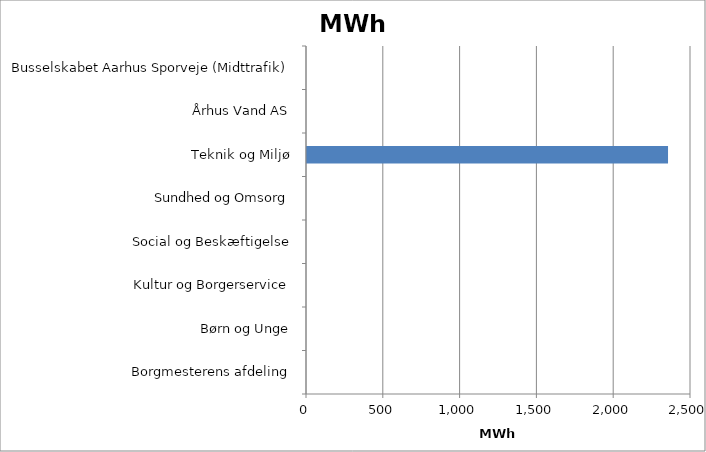
| Category | Varmeforbrug MWh |
|---|---|
| Borgmesterens afdeling | 0 |
| Børn og Unge | 0 |
| Kultur og Borgerservice | 0 |
| Social og Beskæftigelse | 0 |
| Sundhed og Omsorg | 0 |
| Teknik og Miljø | 2350.462 |
| Århus Vand AS | 0 |
| Busselskabet Aarhus Sporveje (Midttrafik) | 0 |